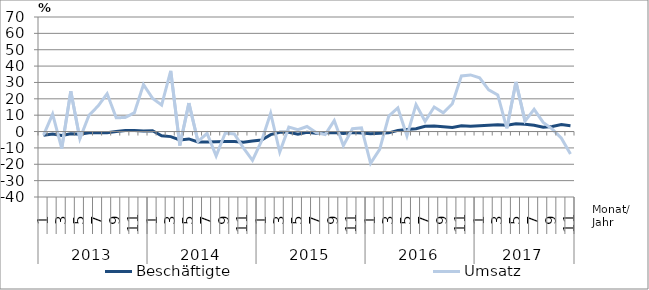
| Category | Beschäftigte | Umsatz |
|---|---|---|
| 0 | -2.3 | -2.2 |
| 1 | -1.5 | 10.7 |
| 2 | -2.4 | -10.3 |
| 3 | -1.3 | 24.6 |
| 4 | -1.6 | -4.4 |
| 5 | -0.7 | 9.9 |
| 6 | -0.8 | 15.6 |
| 7 | -0.8 | 23.1 |
| 8 | 0 | 8.4 |
| 9 | 0.7 | 8.6 |
| 10 | 0.6 | 11.5 |
| 11 | 0.3 | 28.7 |
| 12 | 0.5 | 20.3 |
| 13 | -2.6 | 16.2 |
| 14 | -3.1 | 37.1 |
| 15 | -5.1 | -8.5 |
| 16 | -4.5 | 17.4 |
| 17 | -6.4 | -6.1 |
| 18 | -6.4 | -1.1 |
| 19 | -6.2 | -14.9 |
| 20 | -6.1 | -0.9 |
| 21 | -6.1 | -1.5 |
| 22 | -6.6 | -10 |
| 23 | -5.8 | -17.6 |
| 24 | -5.2 | -5.7 |
| 25 | -1.9 | 11.2 |
| 26 | -0.5 | -12.5 |
| 27 | -0.5 | 2.7 |
| 28 | -1.7 | 1.2 |
| 29 | -0.5 | 3.1 |
| 30 | -1.1 | -0.6 |
| 31 | -0.8 | -1.8 |
| 32 | -0.6 | 6.7 |
| 33 | -1.2 | -8.6 |
| 34 | -0.6 | 1.7 |
| 35 | -0.9 | 2.2 |
| 36 | -1.3 | -19.4 |
| 37 | -1.1 | -10.9 |
| 38 | -0.8 | 9.4 |
| 39 | 0.7 | 14.4 |
| 40 | 1.2 | -2.6 |
| 41 | 1.7 | 16.5 |
| 42 | 3.2 | 6.3 |
| 43 | 3.4 | 15 |
| 44 | 3 | 11.5 |
| 45 | 2.5 | 17 |
| 46 | 3.6 | 34 |
| 47 | 3.2 | 34.6 |
| 48 | 3.5 | 32.8 |
| 49 | 3.8 | 25.5 |
| 50 | 4.2 | 22.3 |
| 51 | 3.9 | 2 |
| 52 | 4.7 | 30.3 |
| 53 | 4.4 | 6.4 |
| 54 | 3.9 | 13.6 |
| 55 | 2.7 | 5.6 |
| 56 | 3.1 | 1.5 |
| 57 | 4.3 | -4.1 |
| 58 | 3.6 | -13.7 |